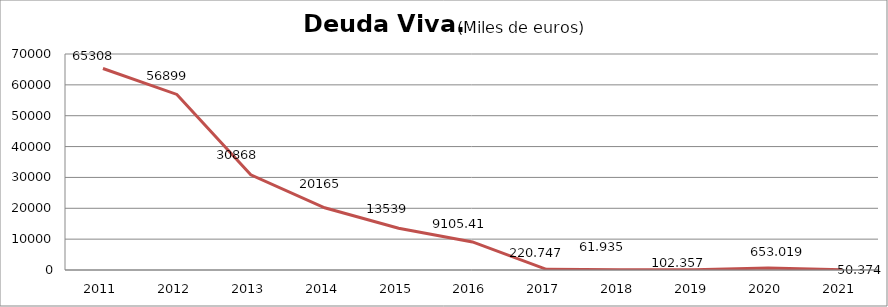
| Category | Deuda Viva. Miles de euros |
|---|---|
| 2011.0 | 65308 |
| 2012.0 | 56899 |
| 2013.0 | 30868 |
| 2014.0 | 20165 |
| 2015.0 | 13539 |
| 2016.0 | 9105.41 |
| 2017.0 | 220.747 |
| 2018.0 | 61.935 |
| 2019.0 | 102.357 |
| 2020.0 | 653.019 |
| 2021.0 | 50.374 |